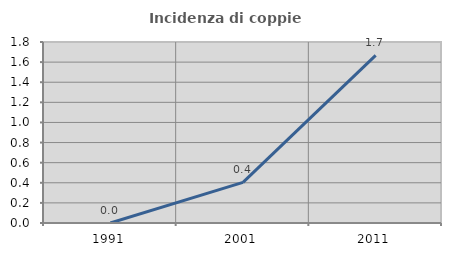
| Category | Incidenza di coppie miste |
|---|---|
| 1991.0 | 0 |
| 2001.0 | 0.404 |
| 2011.0 | 1.667 |